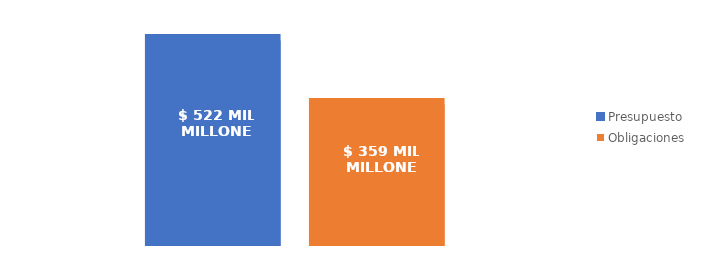
| Category | Presupuesto | Obligaciones |
|---|---|---|
| Total | 522027303827.778 | 358571666238.576 |